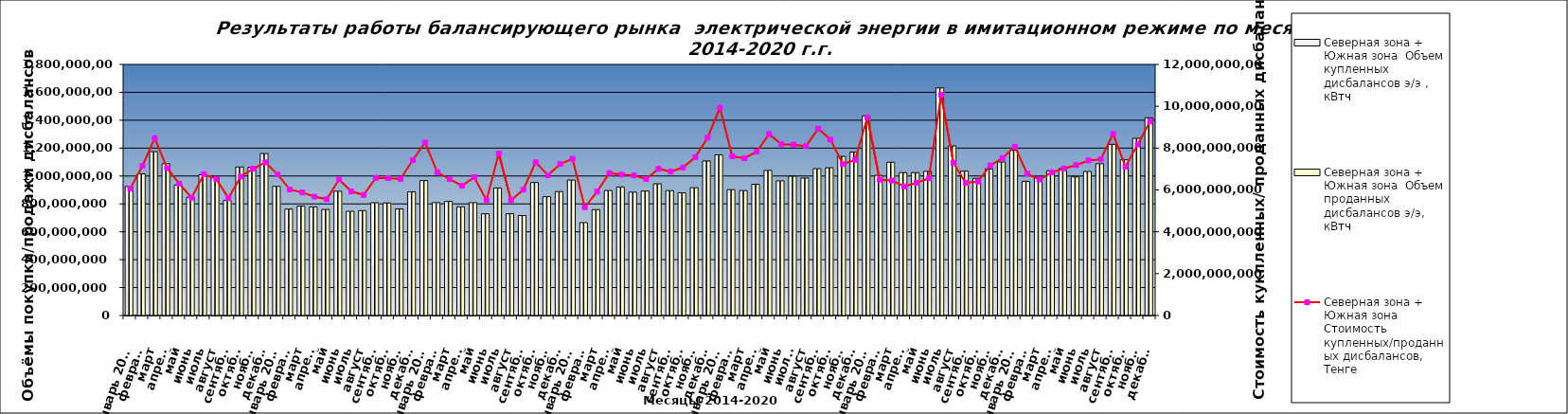
| Category | Северная зона + Южная зона  |
|---|---|
| Январь 2014 | 924739284 |
| февраль | 1016093702.384 |
| март | 1174705645.406 |
| апрель | 1087907080.684 |
| май | 935750304.995 |
| июнь | 847818958.866 |
| июль | 1009391712.959 |
| август | 995738068.063 |
| сентябрь | 824126455 |
| октябрь | 1064617824 |
| ноябрь | 1062678806 |
| декабрь | 1160936267 |
| Январь 2015 | 925445955 |
| февраль | 762572492 |
| март | 783913656 |
| апрель | 779064987 |
| май | 760110020.661 |
| июнь | 890849959 |
| июль | 747146958.399 |
| август | 751652519 |
| сентябрь | 808591350 |
| октябрь | 807025374 |
| ноябрь | 764375815.213 |
| декабрь | 886423555.754 |
| Январь 2016 | 966968324 |
| февраль | 809346053 |
| март | 817429468.32 |
| апрель | 779159668 |
| май | 809149783 |
| июнь | 729028134 |
| июль | 914277940 |
| август | 729796727 |
| сентябрь | 716350945 |
| октябрь | 953183880 |
| ноябрь | 851482247 |
| декабрь | 888338148 |
| Январь 2017 | 971083709 |
| февраль | 665842864 |
| март | 759150181 |
| апрель | 895985259 |
| май | 921395251 |
| июнь | 884253517 |
| июль | 892223641 |
| август | 944163132 |
| сентябрь | 895015870 |
| октябрь | 879216956 |
| ноябрь | 916317054 |
| декабрь | 1107982582 |
| Январь 2018 | 1151647125 |
| февраль | 902370810 |
| март | 895738870 |
| апрель | 940384406 |
| май | 1039722030 |
| июнь | 965602041 |
| июль  | 998286995 |
| август | 985476578 |
| сентябрь | 1052489938 |
| октябрь | 1059151630 |
| ноябрь | 1141342520 |
| декабрь | 1171267760 |
| Январь 2019 | 1431004215 |
| февраль | 1004281701 |
| март | 1098544326 |
| апрель | 1024157717 |
| май | 1024126231 |
| июнь | 1033955216 |
| июль | 1631697005 |
| август | 1216060459 |
| сентябрь | 1034992708 |
| октябрь | 983021804 |
| ноябрь | 1050878628.667 |
| декабрь | 1100234299 |
| Январь 2020 | 1185343835 |
| февраль | 961965952 |
| март | 990945707 |
| апрель | 1036989889 |
| май | 1053452160 |
| июнь | 993498676 |
| июль | 1032566852 |
| август | 1088245315 |
| сентябрь | 1227183127 |
| октябрь | 1116237728.39 |
| ноябрь | 1269916508 |
| декабрь | 1417867756 |